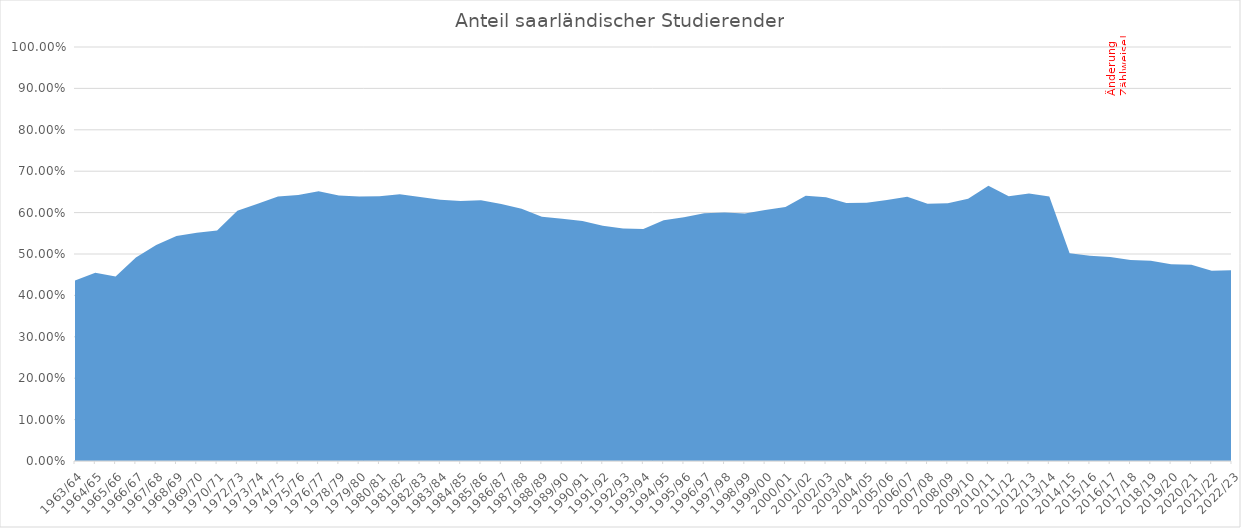
| Category | Saarland |
|---|---|
| 1963/64 | 0.436 |
| 1964/65 | 0.455 |
| 1965/66 | 0.446 |
| 1966/67 | 0.491 |
| 1967/68 | 0.521 |
| 1968/69 | 0.543 |
| 1969/70 | 0.551 |
| 1970/71 | 0.557 |
| 1972/73 | 0.605 |
| 1973/74 | 0.622 |
| 1974/75 | 0.639 |
| 1975/76 | 0.643 |
| 1976/77 | 0.651 |
| 1978/79 | 0.641 |
| 1979/80 | 0.639 |
| 1980/81 | 0.64 |
| 1981/82 | 0.644 |
| 1982/83 | 0.637 |
| 1983/84 | 0.631 |
| 1984/85 | 0.628 |
| 1985/86 | 0.63 |
| 1986/87 | 0.621 |
| 1987/88 | 0.609 |
| 1988/89 | 0.59 |
| 1989/90 | 0.585 |
| 1990/91 | 0.58 |
| 1991/92 | 0.568 |
| 1992/93 | 0.562 |
| 1993/94 | 0.561 |
| 1994/95 | 0.582 |
| 1995/96 | 0.589 |
| 1996/97 | 0.599 |
| 1997/98 | 0.6 |
| 1998/99 | 0.598 |
| 1999/00 | 0.606 |
| 2000/01 | 0.614 |
| 2001/02 | 0.641 |
| 2002/03 | 0.637 |
| 2003/04 | 0.623 |
| 2004/05 | 0.624 |
| 2005/06 | 0.631 |
| 2006/07 | 0.638 |
| 2007/08 | 0.621 |
| 2008/09 | 0.623 |
| 2009/10 | 0.633 |
| 2010/11 | 0.665 |
| 2011/12 | 0.639 |
| 2012/13 | 0.646 |
| 2013/14 | 0.639 |
| 2014/15 | 0.502 |
| 2015/16 | 0.496 |
| 2016/17 | 0.493 |
| 2017/18 | 0.485 |
| 2018/19 | 0.484 |
| 2019/20 | 0.475 |
| 2020/21 | 0.474 |
| 2021/22 | 0.46 |
| 2022/23 | 0.461 |